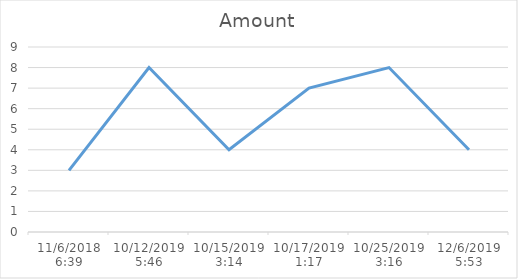
| Category | Amount |
|---|---|
| 11/6/18 | 3 |
| 10/12/19 | 8 |
| 10/15/19 | 4 |
| 10/17/19 | 7 |
| 10/25/19 | 8 |
| 12/6/19 | 4 |